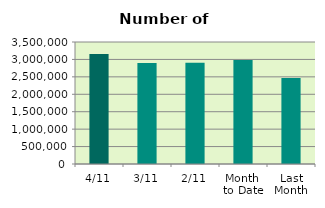
| Category | Series 0 |
|---|---|
| 4/11 | 3154480 |
| 3/11 | 2894018 |
| 2/11 | 2904682 |
| Month 
to Date | 2984393.333 |
| Last
Month | 2465363.545 |